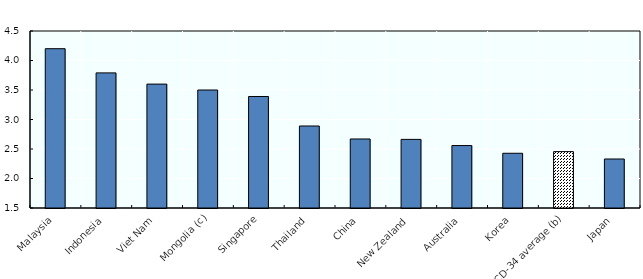
| Category | All households |
|---|---|
| Malaysia | 4.2 |
| Indonesia | 3.79 |
| Viet Nam | 3.6 |
| Mongolia (c) | 3.5 |
| Singapore | 3.39 |
| Thailand | 2.89 |
| China | 2.67 |
| New Zealand | 2.663 |
| Australia | 2.558 |
| Korea | 2.428 |
| OECD-34 average (b) | 2.456 |
| Japan | 2.331 |